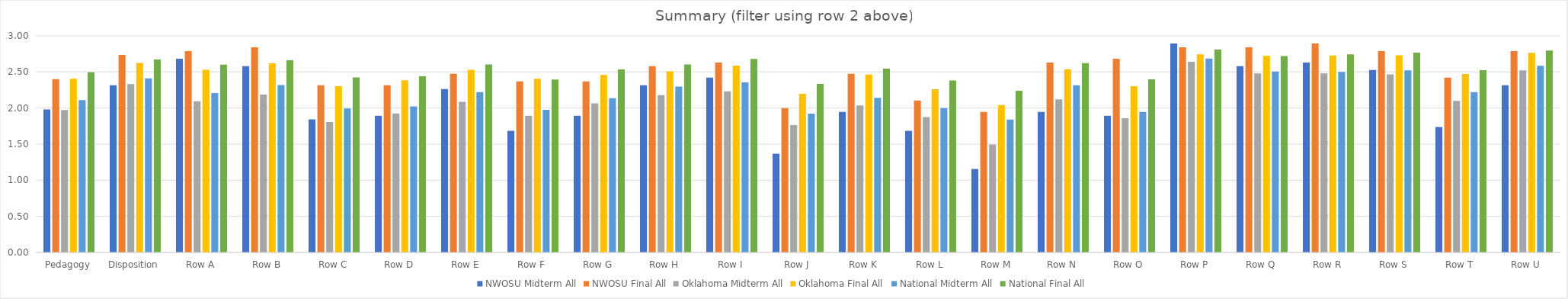
| Category | NWOSU | Oklahoma | National |
|---|---|---|---|
| Pedagogy | 2.401 | 2.407 | 2.496 |
| Disposition | 2.737 | 2.625 | 2.673 |
| Row A | 2.79 | 2.529 | 2.602 |
| Row B | 2.842 | 2.62 | 2.661 |
| Row C | 2.316 | 2.302 | 2.424 |
| Row D | 2.316 | 2.384 | 2.441 |
| Row E | 2.474 | 2.529 | 2.604 |
| Row F | 2.368 | 2.405 | 2.395 |
| Row G | 2.368 | 2.459 | 2.536 |
| Row H | 2.579 | 2.508 | 2.604 |
| Row I | 2.632 | 2.587 | 2.68 |
| Row J | 2 | 2.198 | 2.336 |
| Row K | 2.474 | 2.463 | 2.546 |
| Row L | 2.105 | 2.26 | 2.383 |
| Row M | 1.947 | 2.041 | 2.24 |
| Row N | 2.632 | 2.537 | 2.622 |
| Row O | 2.684 | 2.302 | 2.398 |
| Row P | 2.842 | 2.744 | 2.809 |
| Row Q | 2.842 | 2.723 | 2.72 |
| Row R | 2.895 | 2.727 | 2.744 |
| Row S | 2.79 | 2.731 | 2.768 |
| Row T | 2.421 | 2.471 | 2.524 |
| Row U | 2.79 | 2.764 | 2.797 |